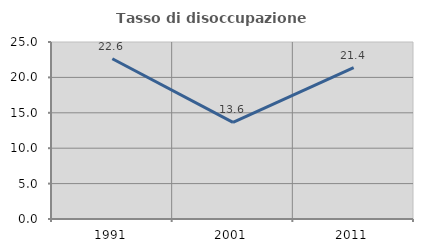
| Category | Tasso di disoccupazione giovanile  |
|---|---|
| 1991.0 | 22.629 |
| 2001.0 | 13.642 |
| 2011.0 | 21.366 |